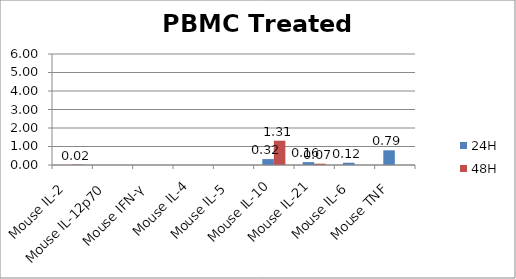
| Category | 24H | 48H |
|---|---|---|
| Mouse IL-2  | 0 | 0.023 |
| Mouse IL-12p70  | 0 | 0 |
| Mouse IFN-γ  | 0 | 0 |
| Mouse IL-4 | 0 | 0 |
| Mouse IL-5  | 0 | 0 |
| Mouse IL-10 | 0.32 | 1.313 |
| Mouse IL-21 | 0.157 | 0.07 |
| Mouse IL-6  | 0.123 | 0 |
| Mouse TNF  | 0.793 | 0 |